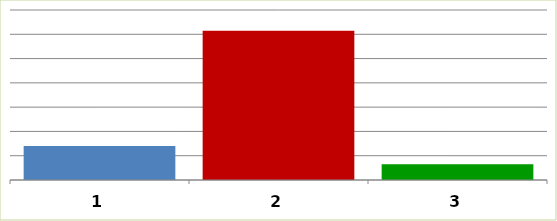
| Category | Series 0 |
|---|---|
| 0 | 14021388 |
| 1 | 61444647 |
| 2 | 6500000 |